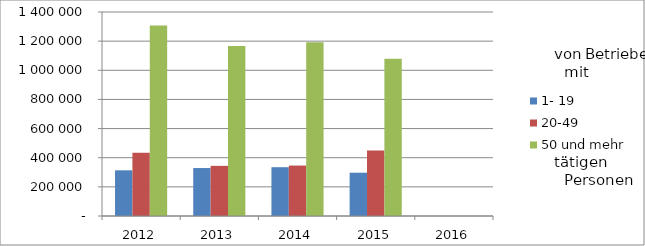
| Category | 1- 19 | 20-49 | 50 und mehr |
|---|---|---|---|
| 2012.0 | 313483.697 | 434366.93 | 1307519.726 |
| 2013.0 | 329108.086 | 344040.657 | 1167298.078 |
| 2014.0 | 334848.153 | 346160.396 | 1192631.258 |
| 2015.0 | 297116.655 | 448998.512 | 1078892.853 |
| 2016.0 | 0 | 0 | 0 |